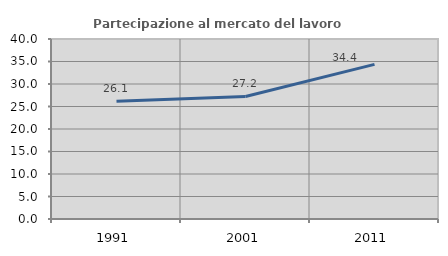
| Category | Partecipazione al mercato del lavoro  femminile |
|---|---|
| 1991.0 | 26.149 |
| 2001.0 | 27.224 |
| 2011.0 | 34.366 |